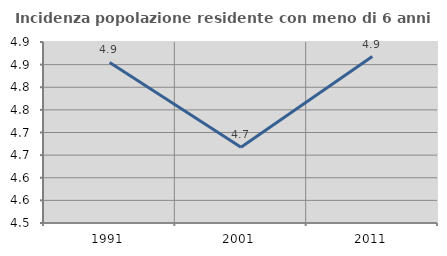
| Category | Incidenza popolazione residente con meno di 6 anni |
|---|---|
| 1991.0 | 4.855 |
| 2001.0 | 4.668 |
| 2011.0 | 4.868 |